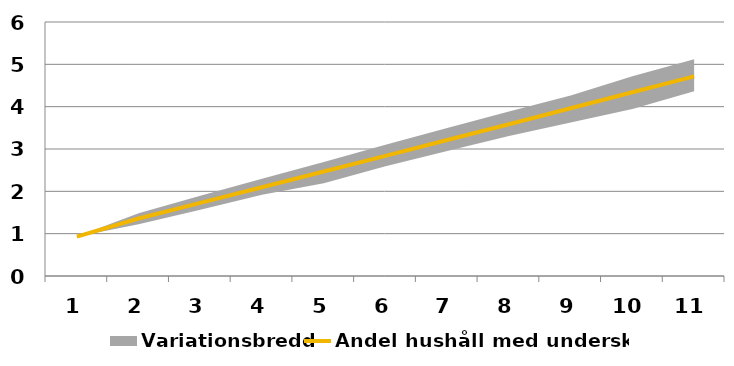
| Category | Andel hushåll med underskott |
|---|---|
| 0 | 0.931 |
| 1 | 1.359 |
| 2 | 1.729 |
| 3 | 2.096 |
| 4 | 2.47 |
| 5 | 2.838 |
| 6 | 3.212 |
| 7 | 3.584 |
| 8 | 3.962 |
| 9 | 4.34 |
| 10 | 4.716 |